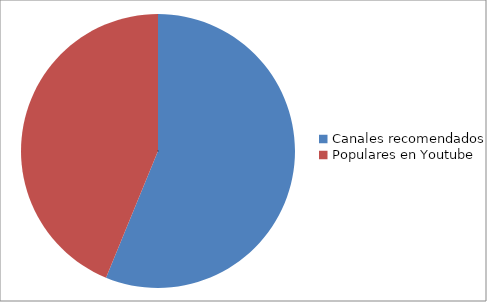
| Category | Series 0 |
|---|---|
| Canales recomendados | 195 |
| Populares en Youtube | 152 |